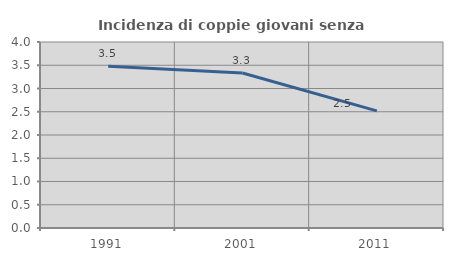
| Category | Incidenza di coppie giovani senza figli |
|---|---|
| 1991.0 | 3.479 |
| 2001.0 | 3.335 |
| 2011.0 | 2.519 |